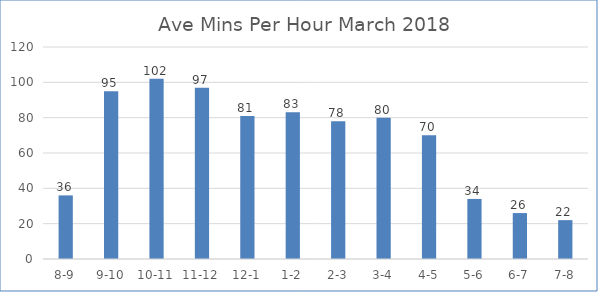
| Category | Ave Mins Per Hour  |
|---|---|
| 8-9 | 36 |
| 9-10 | 95 |
| 10-11 | 102 |
| 11-12 | 97 |
| 12-1 | 81 |
| 1-2 | 83 |
| 2-3 | 78 |
| 3-4 | 80 |
| 4-5 | 70 |
| 5-6 | 34 |
| 6-7 | 26 |
| 7-8 | 22 |